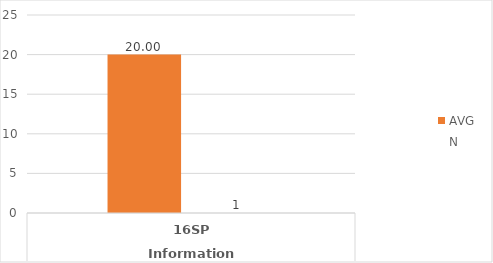
| Category | MATH.AS - AVG | MATH.AS - N |
|---|---|---|
| 0 | 20 | 1 |